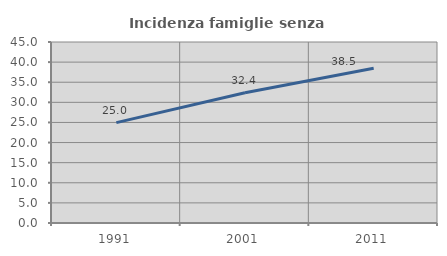
| Category | Incidenza famiglie senza nuclei |
|---|---|
| 1991.0 | 24.964 |
| 2001.0 | 32.374 |
| 2011.0 | 38.462 |